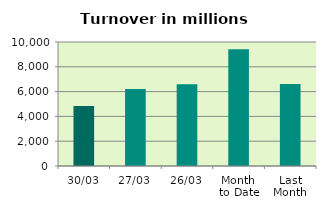
| Category | Series 0 |
|---|---|
| 30/03 | 4844.408 |
| 27/03 | 6219.12 |
| 26/03 | 6584.447 |
| Month 
to Date | 9414.077 |
| Last
Month | 6605.047 |